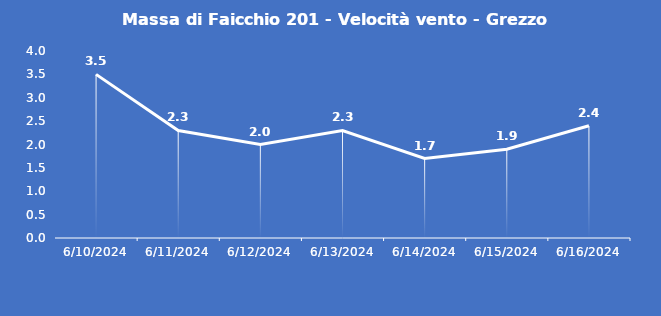
| Category | Massa di Faicchio 201 - Velocità vento - Grezzo (m/s) |
|---|---|
| 6/10/24 | 3.5 |
| 6/11/24 | 2.3 |
| 6/12/24 | 2 |
| 6/13/24 | 2.3 |
| 6/14/24 | 1.7 |
| 6/15/24 | 1.9 |
| 6/16/24 | 2.4 |